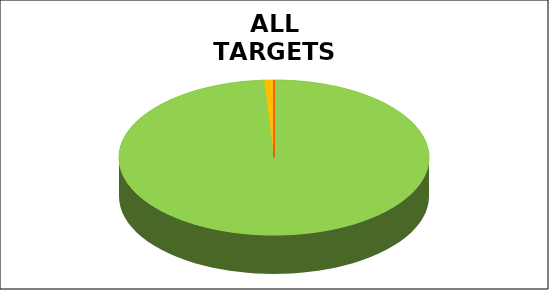
| Category | Series 0 |
|---|---|
| Green | 0.99 |
| Amber | 0.01 |
| Red | 0 |